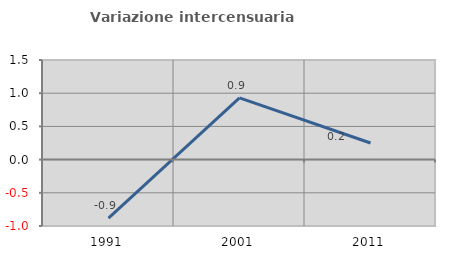
| Category | Variazione intercensuaria annua |
|---|---|
| 1991.0 | -0.882 |
| 2001.0 | 0.929 |
| 2011.0 | 0.25 |